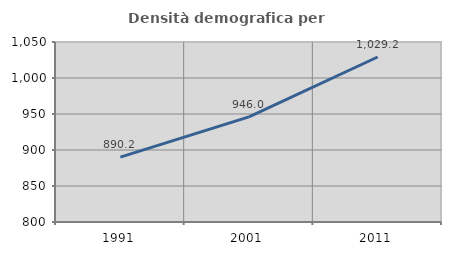
| Category | Densità demografica |
|---|---|
| 1991.0 | 890.189 |
| 2001.0 | 946.043 |
| 2011.0 | 1029.156 |